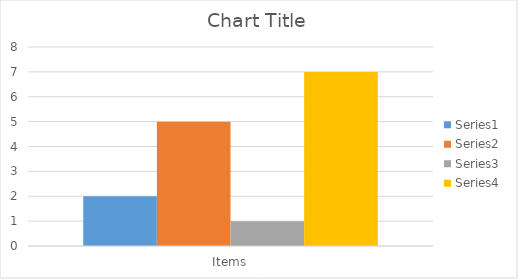
| Category | Series 0 | Series 1 | Series 2 | Series 3 |
|---|---|---|---|---|
| Items | 2 | 5 | 1 | 7 |